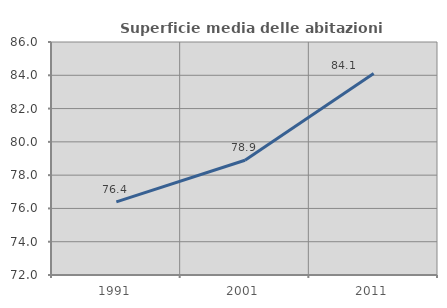
| Category | Superficie media delle abitazioni occupate |
|---|---|
| 1991.0 | 76.396 |
| 2001.0 | 78.893 |
| 2011.0 | 84.113 |